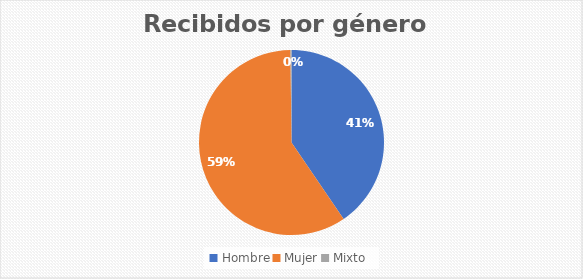
| Category | Recibidos por género  Cantidad |
|---|---|
| Hombre | 221 |
| Mujer | 324 |
| Mixto | 1 |